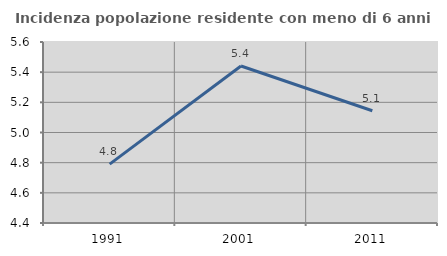
| Category | Incidenza popolazione residente con meno di 6 anni |
|---|---|
| 1991.0 | 4.79 |
| 2001.0 | 5.441 |
| 2011.0 | 5.144 |